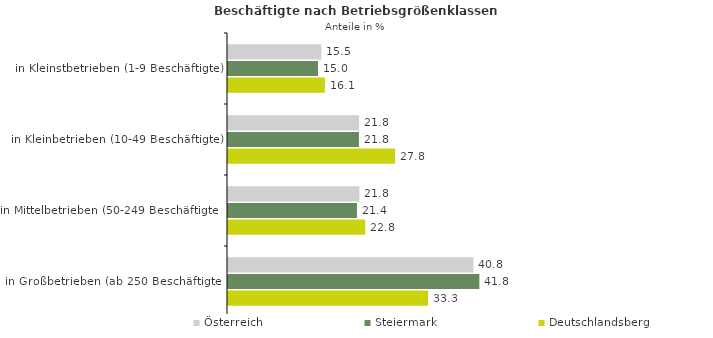
| Category | Österreich | Steiermark | Deutschlandsberg |
|---|---|---|---|
| in Kleinstbetrieben (1-9 Beschäftigte) | 15.526 | 14.966 | 16.119 |
| in Kleinbetrieben (10-49 Beschäftigte) | 21.796 | 21.781 | 27.786 |
| in Mittelbetrieben (50-249 Beschäftigte) | 21.849 | 21.447 | 22.813 |
| in Großbetrieben (ab 250 Beschäftigte) | 40.829 | 41.806 | 33.282 |